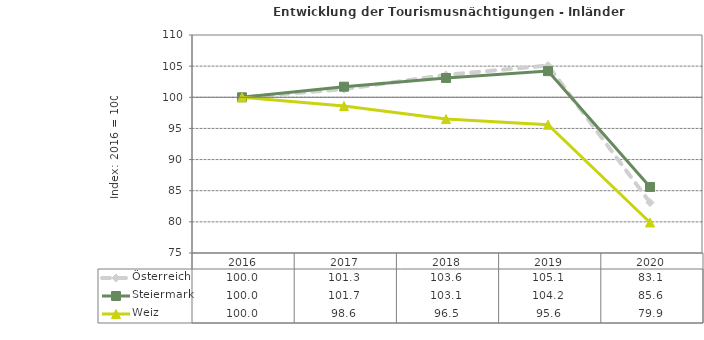
| Category | Österreich | Steiermark | Weiz |
|---|---|---|---|
| 2020.0 | 83.1 | 85.6 | 79.9 |
| 2019.0 | 105.1 | 104.2 | 95.6 |
| 2018.0 | 103.6 | 103.1 | 96.5 |
| 2017.0 | 101.3 | 101.7 | 98.6 |
| 2016.0 | 100 | 100 | 100 |